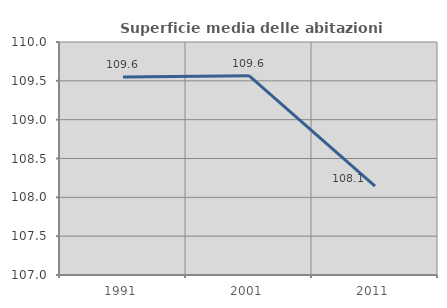
| Category | Superficie media delle abitazioni occupate |
|---|---|
| 1991.0 | 109.55 |
| 2001.0 | 109.566 |
| 2011.0 | 108.144 |